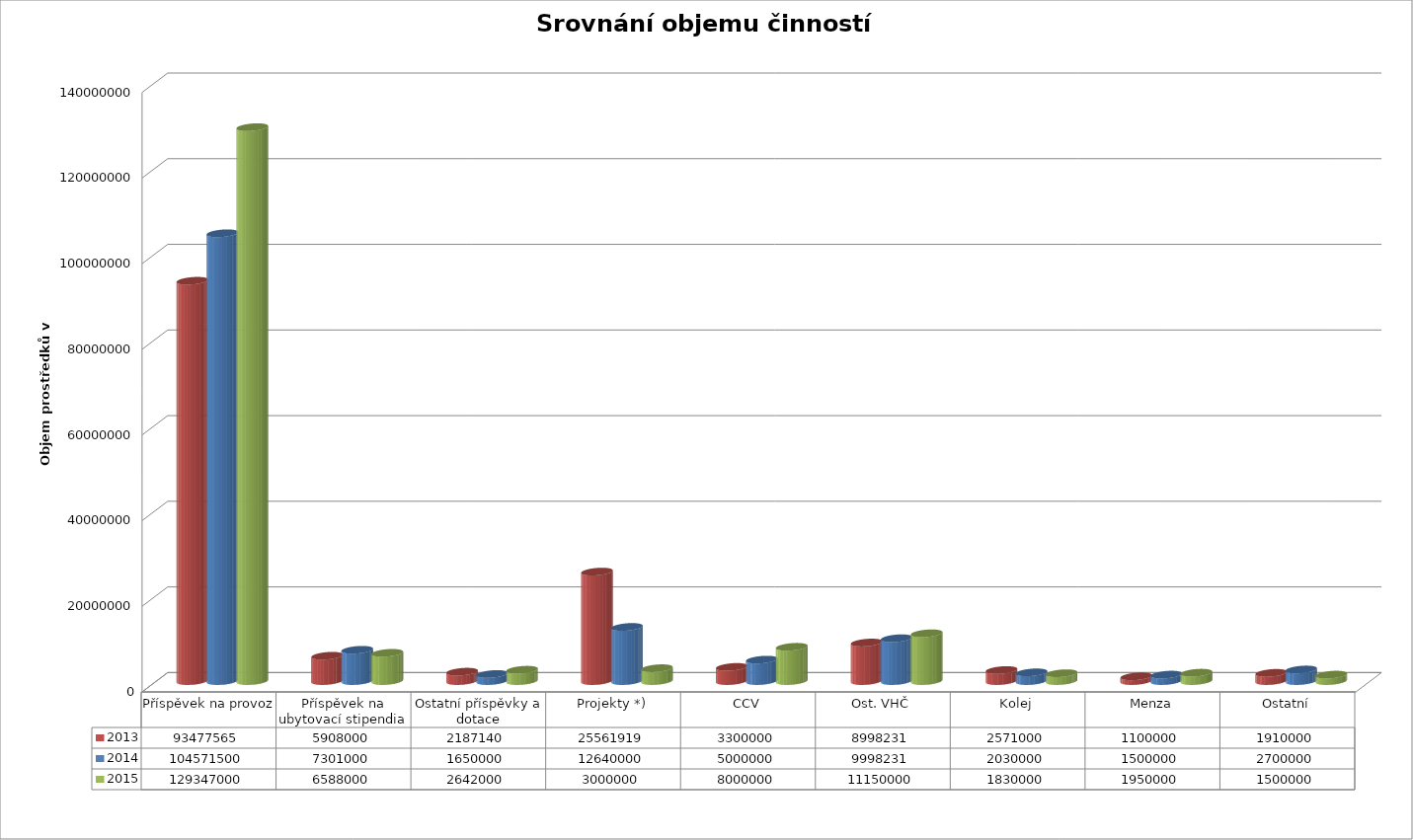
| Category | 2013 | 2014 | 2015 |
|---|---|---|---|
| Příspěvek na provoz | 93477565 | 104571500 | 129347000 |
| Příspěvek na ubytovací stipendia | 5908000 | 7301000 | 6588000 |
| Ostatní příspěvky a dotace | 2187140 | 1650000 | 2642000 |
| Projekty *) | 25561919 | 12640000 | 3000000 |
| CCV | 3300000 | 5000000 | 8000000 |
| Ost. VHČ | 8998231 | 9998231 | 11150000 |
| Kolej | 2571000 | 2030000 | 1830000 |
| Menza | 1100000 | 1500000 | 1950000 |
| Ostatní | 1910000 | 2700000 | 1500000 |